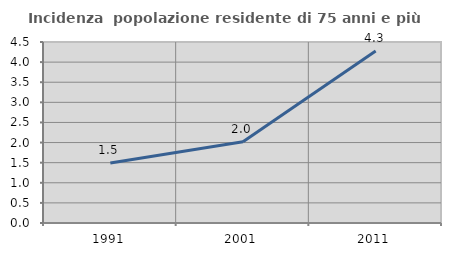
| Category | Incidenza  popolazione residente di 75 anni e più |
|---|---|
| 1991.0 | 1.49 |
| 2001.0 | 2.018 |
| 2011.0 | 4.278 |